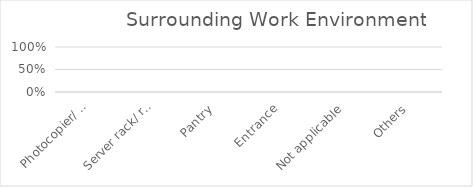
| Category | Series 0 |
|---|---|
| Photocopier/ Printer | 0 |
| Server rack/ room | 0 |
| Pantry | 0 |
| Entrance | 0 |
| Not applicable | 0 |
| Others | 0 |